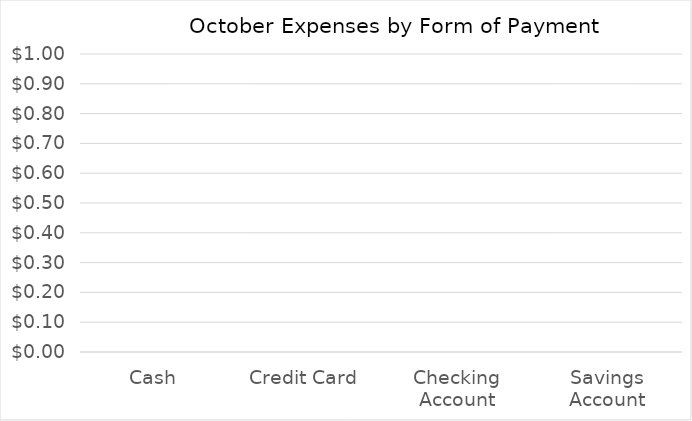
| Category | Series 0 |
|---|---|
| Cash | 0 |
| Credit Card | 0 |
| Checking Account | 0 |
| Savings Account | 0 |